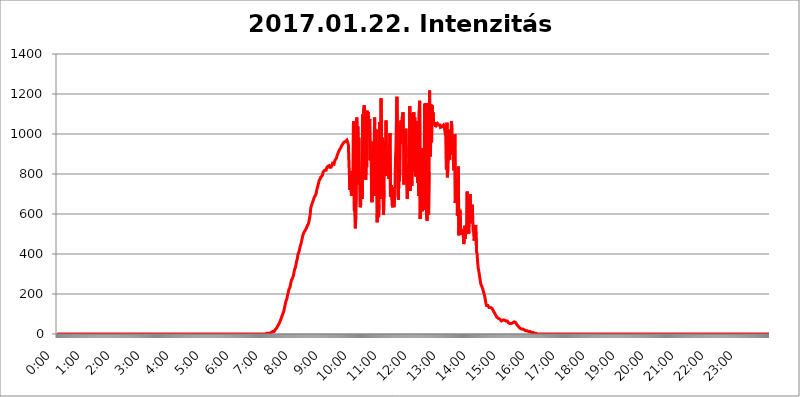
| Category | 2017.01.22. Intenzitás [W/m^2] |
|---|---|
| 0.0 | 0 |
| 0.0006944444444444445 | 0 |
| 0.001388888888888889 | 0 |
| 0.0020833333333333333 | 0 |
| 0.002777777777777778 | 0 |
| 0.003472222222222222 | 0 |
| 0.004166666666666667 | 0 |
| 0.004861111111111111 | 0 |
| 0.005555555555555556 | 0 |
| 0.0062499999999999995 | 0 |
| 0.006944444444444444 | 0 |
| 0.007638888888888889 | 0 |
| 0.008333333333333333 | 0 |
| 0.009027777777777779 | 0 |
| 0.009722222222222222 | 0 |
| 0.010416666666666666 | 0 |
| 0.011111111111111112 | 0 |
| 0.011805555555555555 | 0 |
| 0.012499999999999999 | 0 |
| 0.013194444444444444 | 0 |
| 0.013888888888888888 | 0 |
| 0.014583333333333332 | 0 |
| 0.015277777777777777 | 0 |
| 0.015972222222222224 | 0 |
| 0.016666666666666666 | 0 |
| 0.017361111111111112 | 0 |
| 0.018055555555555557 | 0 |
| 0.01875 | 0 |
| 0.019444444444444445 | 0 |
| 0.02013888888888889 | 0 |
| 0.020833333333333332 | 0 |
| 0.02152777777777778 | 0 |
| 0.022222222222222223 | 0 |
| 0.02291666666666667 | 0 |
| 0.02361111111111111 | 0 |
| 0.024305555555555556 | 0 |
| 0.024999999999999998 | 0 |
| 0.025694444444444447 | 0 |
| 0.02638888888888889 | 0 |
| 0.027083333333333334 | 0 |
| 0.027777777777777776 | 0 |
| 0.02847222222222222 | 0 |
| 0.029166666666666664 | 0 |
| 0.029861111111111113 | 0 |
| 0.030555555555555555 | 0 |
| 0.03125 | 0 |
| 0.03194444444444445 | 0 |
| 0.03263888888888889 | 0 |
| 0.03333333333333333 | 0 |
| 0.034027777777777775 | 0 |
| 0.034722222222222224 | 0 |
| 0.035416666666666666 | 0 |
| 0.036111111111111115 | 0 |
| 0.03680555555555556 | 0 |
| 0.0375 | 0 |
| 0.03819444444444444 | 0 |
| 0.03888888888888889 | 0 |
| 0.03958333333333333 | 0 |
| 0.04027777777777778 | 0 |
| 0.04097222222222222 | 0 |
| 0.041666666666666664 | 0 |
| 0.042361111111111106 | 0 |
| 0.04305555555555556 | 0 |
| 0.043750000000000004 | 0 |
| 0.044444444444444446 | 0 |
| 0.04513888888888889 | 0 |
| 0.04583333333333334 | 0 |
| 0.04652777777777778 | 0 |
| 0.04722222222222222 | 0 |
| 0.04791666666666666 | 0 |
| 0.04861111111111111 | 0 |
| 0.049305555555555554 | 0 |
| 0.049999999999999996 | 0 |
| 0.05069444444444445 | 0 |
| 0.051388888888888894 | 0 |
| 0.052083333333333336 | 0 |
| 0.05277777777777778 | 0 |
| 0.05347222222222222 | 0 |
| 0.05416666666666667 | 0 |
| 0.05486111111111111 | 0 |
| 0.05555555555555555 | 0 |
| 0.05625 | 0 |
| 0.05694444444444444 | 0 |
| 0.057638888888888885 | 0 |
| 0.05833333333333333 | 0 |
| 0.05902777777777778 | 0 |
| 0.059722222222222225 | 0 |
| 0.06041666666666667 | 0 |
| 0.061111111111111116 | 0 |
| 0.06180555555555556 | 0 |
| 0.0625 | 0 |
| 0.06319444444444444 | 0 |
| 0.06388888888888888 | 0 |
| 0.06458333333333334 | 0 |
| 0.06527777777777778 | 0 |
| 0.06597222222222222 | 0 |
| 0.06666666666666667 | 0 |
| 0.06736111111111111 | 0 |
| 0.06805555555555555 | 0 |
| 0.06874999999999999 | 0 |
| 0.06944444444444443 | 0 |
| 0.07013888888888889 | 0 |
| 0.07083333333333333 | 0 |
| 0.07152777777777779 | 0 |
| 0.07222222222222223 | 0 |
| 0.07291666666666667 | 0 |
| 0.07361111111111111 | 0 |
| 0.07430555555555556 | 0 |
| 0.075 | 0 |
| 0.07569444444444444 | 0 |
| 0.0763888888888889 | 0 |
| 0.07708333333333334 | 0 |
| 0.07777777777777778 | 0 |
| 0.07847222222222222 | 0 |
| 0.07916666666666666 | 0 |
| 0.0798611111111111 | 0 |
| 0.08055555555555556 | 0 |
| 0.08125 | 0 |
| 0.08194444444444444 | 0 |
| 0.08263888888888889 | 0 |
| 0.08333333333333333 | 0 |
| 0.08402777777777777 | 0 |
| 0.08472222222222221 | 0 |
| 0.08541666666666665 | 0 |
| 0.08611111111111112 | 0 |
| 0.08680555555555557 | 0 |
| 0.08750000000000001 | 0 |
| 0.08819444444444445 | 0 |
| 0.08888888888888889 | 0 |
| 0.08958333333333333 | 0 |
| 0.09027777777777778 | 0 |
| 0.09097222222222222 | 0 |
| 0.09166666666666667 | 0 |
| 0.09236111111111112 | 0 |
| 0.09305555555555556 | 0 |
| 0.09375 | 0 |
| 0.09444444444444444 | 0 |
| 0.09513888888888888 | 0 |
| 0.09583333333333333 | 0 |
| 0.09652777777777777 | 0 |
| 0.09722222222222222 | 0 |
| 0.09791666666666667 | 0 |
| 0.09861111111111111 | 0 |
| 0.09930555555555555 | 0 |
| 0.09999999999999999 | 0 |
| 0.10069444444444443 | 0 |
| 0.1013888888888889 | 0 |
| 0.10208333333333335 | 0 |
| 0.10277777777777779 | 0 |
| 0.10347222222222223 | 0 |
| 0.10416666666666667 | 0 |
| 0.10486111111111111 | 0 |
| 0.10555555555555556 | 0 |
| 0.10625 | 0 |
| 0.10694444444444444 | 0 |
| 0.1076388888888889 | 0 |
| 0.10833333333333334 | 0 |
| 0.10902777777777778 | 0 |
| 0.10972222222222222 | 0 |
| 0.1111111111111111 | 0 |
| 0.11180555555555556 | 0 |
| 0.11180555555555556 | 0 |
| 0.1125 | 0 |
| 0.11319444444444444 | 0 |
| 0.11388888888888889 | 0 |
| 0.11458333333333333 | 0 |
| 0.11527777777777777 | 0 |
| 0.11597222222222221 | 0 |
| 0.11666666666666665 | 0 |
| 0.1173611111111111 | 0 |
| 0.11805555555555557 | 0 |
| 0.11944444444444445 | 0 |
| 0.12013888888888889 | 0 |
| 0.12083333333333333 | 0 |
| 0.12152777777777778 | 0 |
| 0.12222222222222223 | 0 |
| 0.12291666666666667 | 0 |
| 0.12291666666666667 | 0 |
| 0.12361111111111112 | 0 |
| 0.12430555555555556 | 0 |
| 0.125 | 0 |
| 0.12569444444444444 | 0 |
| 0.12638888888888888 | 0 |
| 0.12708333333333333 | 0 |
| 0.16875 | 0 |
| 0.12847222222222224 | 0 |
| 0.12916666666666668 | 0 |
| 0.12986111111111112 | 0 |
| 0.13055555555555556 | 0 |
| 0.13125 | 0 |
| 0.13194444444444445 | 0 |
| 0.1326388888888889 | 0 |
| 0.13333333333333333 | 0 |
| 0.13402777777777777 | 0 |
| 0.13402777777777777 | 0 |
| 0.13472222222222222 | 0 |
| 0.13541666666666666 | 0 |
| 0.1361111111111111 | 0 |
| 0.13749999999999998 | 0 |
| 0.13819444444444443 | 0 |
| 0.1388888888888889 | 0 |
| 0.13958333333333334 | 0 |
| 0.14027777777777778 | 0 |
| 0.14097222222222222 | 0 |
| 0.14166666666666666 | 0 |
| 0.1423611111111111 | 0 |
| 0.14305555555555557 | 0 |
| 0.14375000000000002 | 0 |
| 0.14444444444444446 | 0 |
| 0.1451388888888889 | 0 |
| 0.1451388888888889 | 0 |
| 0.14652777777777778 | 0 |
| 0.14722222222222223 | 0 |
| 0.14791666666666667 | 0 |
| 0.1486111111111111 | 0 |
| 0.14930555555555555 | 0 |
| 0.15 | 0 |
| 0.15069444444444444 | 0 |
| 0.15138888888888888 | 0 |
| 0.15208333333333332 | 0 |
| 0.15277777777777776 | 0 |
| 0.15347222222222223 | 0 |
| 0.15416666666666667 | 0 |
| 0.15486111111111112 | 0 |
| 0.15555555555555556 | 0 |
| 0.15625 | 0 |
| 0.15694444444444444 | 0 |
| 0.15763888888888888 | 0 |
| 0.15833333333333333 | 0 |
| 0.15902777777777777 | 0 |
| 0.15972222222222224 | 0 |
| 0.16041666666666668 | 0 |
| 0.16111111111111112 | 0 |
| 0.16180555555555556 | 0 |
| 0.1625 | 0 |
| 0.16319444444444445 | 0 |
| 0.1638888888888889 | 0 |
| 0.16458333333333333 | 0 |
| 0.16527777777777777 | 0 |
| 0.16597222222222222 | 0 |
| 0.16666666666666666 | 0 |
| 0.1673611111111111 | 0 |
| 0.16805555555555554 | 0 |
| 0.16874999999999998 | 0 |
| 0.16944444444444443 | 0 |
| 0.17013888888888887 | 0 |
| 0.1708333333333333 | 0 |
| 0.17152777777777775 | 0 |
| 0.17222222222222225 | 0 |
| 0.1729166666666667 | 0 |
| 0.17361111111111113 | 0 |
| 0.17430555555555557 | 0 |
| 0.17500000000000002 | 0 |
| 0.17569444444444446 | 0 |
| 0.1763888888888889 | 0 |
| 0.17708333333333334 | 0 |
| 0.17777777777777778 | 0 |
| 0.17847222222222223 | 0 |
| 0.17916666666666667 | 0 |
| 0.1798611111111111 | 0 |
| 0.18055555555555555 | 0 |
| 0.18125 | 0 |
| 0.18194444444444444 | 0 |
| 0.1826388888888889 | 0 |
| 0.18333333333333335 | 0 |
| 0.1840277777777778 | 0 |
| 0.18472222222222223 | 0 |
| 0.18541666666666667 | 0 |
| 0.18611111111111112 | 0 |
| 0.18680555555555556 | 0 |
| 0.1875 | 0 |
| 0.18819444444444444 | 0 |
| 0.18888888888888888 | 0 |
| 0.18958333333333333 | 0 |
| 0.19027777777777777 | 0 |
| 0.1909722222222222 | 0 |
| 0.19166666666666665 | 0 |
| 0.19236111111111112 | 0 |
| 0.19305555555555554 | 0 |
| 0.19375 | 0 |
| 0.19444444444444445 | 0 |
| 0.1951388888888889 | 0 |
| 0.19583333333333333 | 0 |
| 0.19652777777777777 | 0 |
| 0.19722222222222222 | 0 |
| 0.19791666666666666 | 0 |
| 0.1986111111111111 | 0 |
| 0.19930555555555554 | 0 |
| 0.19999999999999998 | 0 |
| 0.20069444444444443 | 0 |
| 0.20138888888888887 | 0 |
| 0.2020833333333333 | 0 |
| 0.2027777777777778 | 0 |
| 0.2034722222222222 | 0 |
| 0.2041666666666667 | 0 |
| 0.20486111111111113 | 0 |
| 0.20555555555555557 | 0 |
| 0.20625000000000002 | 0 |
| 0.20694444444444446 | 0 |
| 0.2076388888888889 | 0 |
| 0.20833333333333334 | 0 |
| 0.20902777777777778 | 0 |
| 0.20972222222222223 | 0 |
| 0.21041666666666667 | 0 |
| 0.2111111111111111 | 0 |
| 0.21180555555555555 | 0 |
| 0.2125 | 0 |
| 0.21319444444444444 | 0 |
| 0.2138888888888889 | 0 |
| 0.21458333333333335 | 0 |
| 0.2152777777777778 | 0 |
| 0.21597222222222223 | 0 |
| 0.21666666666666667 | 0 |
| 0.21736111111111112 | 0 |
| 0.21805555555555556 | 0 |
| 0.21875 | 0 |
| 0.21944444444444444 | 0 |
| 0.22013888888888888 | 0 |
| 0.22083333333333333 | 0 |
| 0.22152777777777777 | 0 |
| 0.2222222222222222 | 0 |
| 0.22291666666666665 | 0 |
| 0.2236111111111111 | 0 |
| 0.22430555555555556 | 0 |
| 0.225 | 0 |
| 0.22569444444444445 | 0 |
| 0.2263888888888889 | 0 |
| 0.22708333333333333 | 0 |
| 0.22777777777777777 | 0 |
| 0.22847222222222222 | 0 |
| 0.22916666666666666 | 0 |
| 0.2298611111111111 | 0 |
| 0.23055555555555554 | 0 |
| 0.23124999999999998 | 0 |
| 0.23194444444444443 | 0 |
| 0.23263888888888887 | 0 |
| 0.2333333333333333 | 0 |
| 0.2340277777777778 | 0 |
| 0.2347222222222222 | 0 |
| 0.2354166666666667 | 0 |
| 0.23611111111111113 | 0 |
| 0.23680555555555557 | 0 |
| 0.23750000000000002 | 0 |
| 0.23819444444444446 | 0 |
| 0.2388888888888889 | 0 |
| 0.23958333333333334 | 0 |
| 0.24027777777777778 | 0 |
| 0.24097222222222223 | 0 |
| 0.24166666666666667 | 0 |
| 0.2423611111111111 | 0 |
| 0.24305555555555555 | 0 |
| 0.24375 | 0 |
| 0.24444444444444446 | 0 |
| 0.24513888888888888 | 0 |
| 0.24583333333333335 | 0 |
| 0.2465277777777778 | 0 |
| 0.24722222222222223 | 0 |
| 0.24791666666666667 | 0 |
| 0.24861111111111112 | 0 |
| 0.24930555555555556 | 0 |
| 0.25 | 0 |
| 0.25069444444444444 | 0 |
| 0.2513888888888889 | 0 |
| 0.2520833333333333 | 0 |
| 0.25277777777777777 | 0 |
| 0.2534722222222222 | 0 |
| 0.25416666666666665 | 0 |
| 0.2548611111111111 | 0 |
| 0.2555555555555556 | 0 |
| 0.25625000000000003 | 0 |
| 0.2569444444444445 | 0 |
| 0.2576388888888889 | 0 |
| 0.25833333333333336 | 0 |
| 0.2590277777777778 | 0 |
| 0.25972222222222224 | 0 |
| 0.2604166666666667 | 0 |
| 0.2611111111111111 | 0 |
| 0.26180555555555557 | 0 |
| 0.2625 | 0 |
| 0.26319444444444445 | 0 |
| 0.2638888888888889 | 0 |
| 0.26458333333333334 | 0 |
| 0.2652777777777778 | 0 |
| 0.2659722222222222 | 0 |
| 0.26666666666666666 | 0 |
| 0.2673611111111111 | 0 |
| 0.26805555555555555 | 0 |
| 0.26875 | 0 |
| 0.26944444444444443 | 0 |
| 0.2701388888888889 | 0 |
| 0.2708333333333333 | 0 |
| 0.27152777777777776 | 0 |
| 0.2722222222222222 | 0 |
| 0.27291666666666664 | 0 |
| 0.2736111111111111 | 0 |
| 0.2743055555555555 | 0 |
| 0.27499999999999997 | 0 |
| 0.27569444444444446 | 0 |
| 0.27638888888888885 | 0 |
| 0.27708333333333335 | 0 |
| 0.2777777777777778 | 0 |
| 0.27847222222222223 | 0 |
| 0.2791666666666667 | 0 |
| 0.2798611111111111 | 0 |
| 0.28055555555555556 | 0 |
| 0.28125 | 0 |
| 0.28194444444444444 | 0 |
| 0.2826388888888889 | 0 |
| 0.2833333333333333 | 0 |
| 0.28402777777777777 | 0 |
| 0.2847222222222222 | 0 |
| 0.28541666666666665 | 0 |
| 0.28611111111111115 | 0 |
| 0.28680555555555554 | 0 |
| 0.28750000000000003 | 0 |
| 0.2881944444444445 | 0 |
| 0.2888888888888889 | 0 |
| 0.28958333333333336 | 0 |
| 0.2902777777777778 | 0 |
| 0.29097222222222224 | 0 |
| 0.2916666666666667 | 0 |
| 0.2923611111111111 | 3.525 |
| 0.29305555555555557 | 3.525 |
| 0.29375 | 3.525 |
| 0.29444444444444445 | 3.525 |
| 0.2951388888888889 | 3.525 |
| 0.29583333333333334 | 3.525 |
| 0.2965277777777778 | 3.525 |
| 0.2972222222222222 | 3.525 |
| 0.29791666666666666 | 3.525 |
| 0.2986111111111111 | 3.525 |
| 0.29930555555555555 | 3.525 |
| 0.3 | 7.887 |
| 0.30069444444444443 | 7.887 |
| 0.3013888888888889 | 7.887 |
| 0.3020833333333333 | 12.257 |
| 0.30277777777777776 | 12.257 |
| 0.3034722222222222 | 12.257 |
| 0.30416666666666664 | 12.257 |
| 0.3048611111111111 | 16.636 |
| 0.3055555555555555 | 21.024 |
| 0.30624999999999997 | 21.024 |
| 0.3069444444444444 | 25.419 |
| 0.3076388888888889 | 29.823 |
| 0.30833333333333335 | 34.234 |
| 0.3090277777777778 | 38.653 |
| 0.30972222222222223 | 43.079 |
| 0.3104166666666667 | 47.511 |
| 0.3111111111111111 | 51.951 |
| 0.31180555555555556 | 56.398 |
| 0.3125 | 60.85 |
| 0.31319444444444444 | 69.775 |
| 0.3138888888888889 | 74.246 |
| 0.3145833333333333 | 83.205 |
| 0.31527777777777777 | 87.692 |
| 0.3159722222222222 | 96.682 |
| 0.31666666666666665 | 101.184 |
| 0.31736111111111115 | 110.201 |
| 0.31805555555555554 | 119.235 |
| 0.31875000000000003 | 132.814 |
| 0.3194444444444445 | 141.884 |
| 0.3201388888888889 | 155.509 |
| 0.32083333333333336 | 164.605 |
| 0.3215277777777778 | 169.156 |
| 0.32222222222222224 | 178.264 |
| 0.3229166666666667 | 191.937 |
| 0.3236111111111111 | 201.058 |
| 0.32430555555555557 | 214.746 |
| 0.325 | 223.873 |
| 0.32569444444444445 | 223.873 |
| 0.3263888888888889 | 233 |
| 0.32708333333333334 | 246.689 |
| 0.3277777777777778 | 251.251 |
| 0.3284722222222222 | 269.49 |
| 0.32916666666666666 | 269.49 |
| 0.3298611111111111 | 278.603 |
| 0.33055555555555555 | 283.156 |
| 0.33125 | 292.259 |
| 0.33194444444444443 | 305.898 |
| 0.3326388888888889 | 319.517 |
| 0.3333333333333333 | 324.052 |
| 0.3340277777777778 | 333.113 |
| 0.3347222222222222 | 342.162 |
| 0.3354166666666667 | 360.221 |
| 0.3361111111111111 | 364.728 |
| 0.3368055555555556 | 378.224 |
| 0.33749999999999997 | 396.164 |
| 0.33819444444444446 | 400.638 |
| 0.33888888888888885 | 409.574 |
| 0.33958333333333335 | 418.492 |
| 0.34027777777777773 | 431.833 |
| 0.34097222222222223 | 440.702 |
| 0.3416666666666666 | 449.551 |
| 0.3423611111111111 | 458.38 |
| 0.3430555555555555 | 471.582 |
| 0.34375 | 480.356 |
| 0.3444444444444445 | 493.475 |
| 0.3451388888888889 | 497.836 |
| 0.3458333333333334 | 506.542 |
| 0.34652777777777777 | 506.542 |
| 0.34722222222222227 | 510.885 |
| 0.34791666666666665 | 519.555 |
| 0.34861111111111115 | 523.88 |
| 0.34930555555555554 | 528.2 |
| 0.35000000000000003 | 532.513 |
| 0.3506944444444444 | 541.121 |
| 0.3513888888888889 | 541.121 |
| 0.3520833333333333 | 549.704 |
| 0.3527777777777778 | 558.261 |
| 0.3534722222222222 | 571.049 |
| 0.3541666666666667 | 583.779 |
| 0.3548611111111111 | 600.661 |
| 0.35555555555555557 | 629.948 |
| 0.35625 | 638.256 |
| 0.35694444444444445 | 642.4 |
| 0.3576388888888889 | 654.791 |
| 0.35833333333333334 | 658.909 |
| 0.3590277777777778 | 667.123 |
| 0.3597222222222222 | 671.22 |
| 0.36041666666666666 | 683.473 |
| 0.3611111111111111 | 683.473 |
| 0.36180555555555555 | 687.544 |
| 0.3625 | 695.666 |
| 0.36319444444444443 | 703.762 |
| 0.3638888888888889 | 719.877 |
| 0.3645833333333333 | 727.896 |
| 0.3652777777777778 | 735.89 |
| 0.3659722222222222 | 747.834 |
| 0.3666666666666667 | 755.766 |
| 0.3673611111111111 | 767.62 |
| 0.3680555555555556 | 771.559 |
| 0.36874999999999997 | 775.492 |
| 0.36944444444444446 | 783.342 |
| 0.37013888888888885 | 783.342 |
| 0.37083333333333335 | 787.258 |
| 0.37152777777777773 | 791.169 |
| 0.37222222222222223 | 798.974 |
| 0.3729166666666666 | 810.641 |
| 0.3736111111111111 | 814.519 |
| 0.3743055555555555 | 814.519 |
| 0.375 | 818.392 |
| 0.3756944444444445 | 818.392 |
| 0.3763888888888889 | 818.392 |
| 0.3770833333333334 | 818.392 |
| 0.37777777777777777 | 829.981 |
| 0.37847222222222227 | 829.981 |
| 0.37916666666666665 | 837.682 |
| 0.37986111111111115 | 837.682 |
| 0.38055555555555554 | 837.682 |
| 0.38125000000000003 | 841.526 |
| 0.3819444444444444 | 833.834 |
| 0.3826388888888889 | 833.834 |
| 0.3833333333333333 | 829.981 |
| 0.3840277777777778 | 833.834 |
| 0.3847222222222222 | 837.682 |
| 0.3854166666666667 | 845.365 |
| 0.3861111111111111 | 853.029 |
| 0.38680555555555557 | 853.029 |
| 0.3875 | 853.029 |
| 0.38819444444444445 | 849.199 |
| 0.3888888888888889 | 860.676 |
| 0.38958333333333334 | 868.305 |
| 0.3902777777777778 | 872.114 |
| 0.3909722222222222 | 868.305 |
| 0.39166666666666666 | 879.719 |
| 0.3923611111111111 | 891.099 |
| 0.39305555555555555 | 894.885 |
| 0.39375 | 894.885 |
| 0.39444444444444443 | 909.996 |
| 0.3951388888888889 | 913.766 |
| 0.3958333333333333 | 913.766 |
| 0.3965277777777778 | 925.06 |
| 0.3972222222222222 | 928.819 |
| 0.3979166666666667 | 932.576 |
| 0.3986111111111111 | 940.082 |
| 0.3993055555555556 | 940.082 |
| 0.39999999999999997 | 947.58 |
| 0.40069444444444446 | 951.327 |
| 0.40138888888888885 | 951.327 |
| 0.40208333333333335 | 958.814 |
| 0.40277777777777773 | 962.555 |
| 0.40347222222222223 | 962.555 |
| 0.4041666666666666 | 962.555 |
| 0.4048611111111111 | 966.295 |
| 0.4055555555555555 | 962.555 |
| 0.40625 | 970.034 |
| 0.4069444444444445 | 970.034 |
| 0.4076388888888889 | 955.071 |
| 0.4083333333333334 | 943.832 |
| 0.40902777777777777 | 868.305 |
| 0.40972222222222227 | 864.493 |
| 0.41041666666666665 | 719.877 |
| 0.41111111111111115 | 814.519 |
| 0.41180555555555554 | 727.896 |
| 0.41250000000000003 | 691.608 |
| 0.4131944444444444 | 723.889 |
| 0.4138888888888889 | 715.858 |
| 0.4145833333333333 | 735.89 |
| 0.4152777777777778 | 1044.762 |
| 0.4159722222222222 | 1063.51 |
| 0.4166666666666667 | 617.436 |
| 0.4173611111111111 | 609.062 |
| 0.41805555555555557 | 528.2 |
| 0.41875 | 592.233 |
| 0.41944444444444445 | 671.22 |
| 0.4201388888888889 | 1082.324 |
| 0.42083333333333334 | 747.834 |
| 0.4215277777777778 | 1037.277 |
| 0.4222222222222222 | 798.974 |
| 0.42291666666666666 | 981.244 |
| 0.4236111111111111 | 795.074 |
| 0.42430555555555555 | 810.641 |
| 0.425 | 634.105 |
| 0.42569444444444443 | 650.667 |
| 0.4263888888888889 | 767.62 |
| 0.4270833333333333 | 795.074 |
| 0.4277777777777778 | 675.311 |
| 0.4284722222222222 | 1097.437 |
| 0.4291666666666667 | 779.42 |
| 0.4298611111111111 | 1127.879 |
| 0.4305555555555556 | 1143.232 |
| 0.43124999999999997 | 1108.816 |
| 0.43194444444444446 | 849.199 |
| 0.43263888888888885 | 771.559 |
| 0.43333333333333335 | 849.199 |
| 0.43402777777777773 | 833.834 |
| 0.43472222222222223 | 1116.426 |
| 0.4354166666666666 | 1059.756 |
| 0.4361111111111111 | 1108.816 |
| 0.4368055555555555 | 1033.537 |
| 0.4375 | 1003.65 |
| 0.4381944444444445 | 1074.789 |
| 0.4388888888888889 | 868.305 |
| 0.4395833333333334 | 894.885 |
| 0.44027777777777777 | 962.555 |
| 0.44097222222222227 | 667.123 |
| 0.44166666666666665 | 658.909 |
| 0.44236111111111115 | 845.365 |
| 0.44305555555555554 | 767.62 |
| 0.44375000000000003 | 723.889 |
| 0.4444444444444444 | 928.819 |
| 0.4451388888888889 | 1082.324 |
| 0.4458333333333333 | 691.608 |
| 0.4465277777777778 | 759.723 |
| 0.4472222222222222 | 1022.323 |
| 0.4479166666666667 | 755.766 |
| 0.4486111111111111 | 558.261 |
| 0.44930555555555557 | 634.105 |
| 0.45 | 683.473 |
| 0.45069444444444445 | 583.779 |
| 0.4513888888888889 | 646.537 |
| 0.45208333333333334 | 1059.756 |
| 0.4527777777777778 | 675.311 |
| 0.4534722222222222 | 795.074 |
| 0.45416666666666666 | 1178.177 |
| 0.4548611111111111 | 860.676 |
| 0.45555555555555555 | 759.723 |
| 0.45625 | 981.244 |
| 0.45694444444444443 | 695.666 |
| 0.4576388888888889 | 596.45 |
| 0.4583333333333333 | 719.877 |
| 0.4590277777777778 | 962.555 |
| 0.4597222222222222 | 814.519 |
| 0.4604166666666667 | 887.309 |
| 0.4611111111111111 | 1067.267 |
| 0.4618055555555556 | 791.169 |
| 0.46249999999999997 | 868.305 |
| 0.46319444444444446 | 902.447 |
| 0.46388888888888885 | 928.819 |
| 0.46458333333333335 | 932.576 |
| 0.46527777777777773 | 775.492 |
| 0.46597222222222223 | 943.832 |
| 0.4666666666666666 | 1003.65 |
| 0.4673611111111111 | 687.544 |
| 0.4680555555555555 | 683.473 |
| 0.46875 | 743.859 |
| 0.4694444444444445 | 747.834 |
| 0.4701388888888889 | 634.105 |
| 0.4708333333333334 | 731.896 |
| 0.47152777777777777 | 683.473 |
| 0.47222222222222227 | 634.105 |
| 0.47291666666666665 | 638.256 |
| 0.47361111111111115 | 703.762 |
| 0.47430555555555554 | 864.493 |
| 0.47500000000000003 | 928.819 |
| 0.4756944444444444 | 925.06 |
| 0.4763888888888889 | 1186.03 |
| 0.4770833333333333 | 992.448 |
| 0.4777777777777778 | 735.89 |
| 0.4784722222222222 | 671.22 |
| 0.4791666666666667 | 791.169 |
| 0.4798611111111111 | 763.674 |
| 0.48055555555555557 | 822.26 |
| 0.48125 | 1018.587 |
| 0.48194444444444445 | 1067.267 |
| 0.4826388888888889 | 951.327 |
| 0.48333333333333334 | 955.071 |
| 0.4840277777777778 | 1086.097 |
| 0.4847222222222222 | 1108.816 |
| 0.48541666666666666 | 1097.437 |
| 0.4861111111111111 | 747.834 |
| 0.48680555555555555 | 902.447 |
| 0.4875 | 943.832 |
| 0.48819444444444443 | 875.918 |
| 0.4888888888888889 | 1026.06 |
| 0.4895833333333333 | 879.719 |
| 0.4902777777777778 | 735.89 |
| 0.4909722222222222 | 675.311 |
| 0.4916666666666667 | 829.981 |
| 0.4923611111111111 | 723.889 |
| 0.4930555555555556 | 822.26 |
| 0.49374999999999997 | 860.676 |
| 0.49444444444444446 | 1139.384 |
| 0.49513888888888885 | 715.858 |
| 0.49583333333333335 | 779.42 |
| 0.49652777777777773 | 1063.51 |
| 0.49722222222222223 | 739.877 |
| 0.4979166666666666 | 1105.019 |
| 0.4986111111111111 | 853.029 |
| 0.4993055555555555 | 810.641 |
| 0.5 | 1108.816 |
| 0.5006944444444444 | 875.918 |
| 0.5013888888888889 | 1082.324 |
| 0.5020833333333333 | 1003.65 |
| 0.5027777777777778 | 787.258 |
| 0.5034722222222222 | 1063.51 |
| 0.5041666666666667 | 955.071 |
| 0.5048611111111111 | 883.516 |
| 0.5055555555555555 | 755.766 |
| 0.50625 | 906.223 |
| 0.5069444444444444 | 691.608 |
| 0.5076388888888889 | 1116.426 |
| 0.5083333333333333 | 1166.46 |
| 0.5090277777777777 | 575.299 |
| 0.5097222222222222 | 629.948 |
| 0.5104166666666666 | 818.392 |
| 0.5111111111111112 | 883.516 |
| 0.5118055555555555 | 613.252 |
| 0.5125000000000001 | 928.819 |
| 0.5131944444444444 | 787.258 |
| 0.513888888888889 | 759.723 |
| 0.5145833333333333 | 860.676 |
| 0.5152777777777778 | 1150.946 |
| 0.5159722222222222 | 787.258 |
| 0.5166666666666667 | 621.613 |
| 0.517361111111111 | 1154.814 |
| 0.5180555555555556 | 588.009 |
| 0.5187499999999999 | 566.793 |
| 0.5194444444444445 | 833.834 |
| 0.5201388888888888 | 667.123 |
| 0.5208333333333334 | 596.45 |
| 0.5215277777777778 | 810.641 |
| 0.5222222222222223 | 1217.812 |
| 0.5229166666666667 | 887.309 |
| 0.5236111111111111 | 925.06 |
| 0.5243055555555556 | 1147.086 |
| 0.525 | 958.814 |
| 0.5256944444444445 | 1143.232 |
| 0.5263888888888889 | 1097.437 |
| 0.5270833333333333 | 1108.816 |
| 0.5277777777777778 | 1059.756 |
| 0.5284722222222222 | 1048.508 |
| 0.5291666666666667 | 1059.756 |
| 0.5298611111111111 | 1044.762 |
| 0.5305555555555556 | 1037.277 |
| 0.53125 | 1056.004 |
| 0.5319444444444444 | 1044.762 |
| 0.5326388888888889 | 1044.762 |
| 0.5333333333333333 | 1052.255 |
| 0.5340277777777778 | 1056.004 |
| 0.5347222222222222 | 1044.762 |
| 0.5354166666666667 | 1044.762 |
| 0.5361111111111111 | 1048.508 |
| 0.5368055555555555 | 1044.762 |
| 0.5375 | 1033.537 |
| 0.5381944444444444 | 1033.537 |
| 0.5388888888888889 | 1037.277 |
| 0.5395833333333333 | 1037.277 |
| 0.5402777777777777 | 1037.277 |
| 0.5409722222222222 | 1033.537 |
| 0.5416666666666666 | 1044.762 |
| 0.5423611111111112 | 1037.277 |
| 0.5430555555555555 | 1033.537 |
| 0.5437500000000001 | 1014.852 |
| 0.5444444444444444 | 992.448 |
| 0.545138888888889 | 1022.323 |
| 0.5458333333333333 | 822.26 |
| 0.5465277777777778 | 1056.004 |
| 0.5472222222222222 | 783.342 |
| 0.5479166666666667 | 837.682 |
| 0.548611111111111 | 875.918 |
| 0.5493055555555556 | 1022.323 |
| 0.5499999999999999 | 872.114 |
| 0.5506944444444445 | 1011.118 |
| 0.5513888888888888 | 917.534 |
| 0.5520833333333334 | 932.576 |
| 0.5527777777777778 | 1063.51 |
| 0.5534722222222223 | 1033.537 |
| 0.5541666666666667 | 894.885 |
| 0.5548611111111111 | 951.327 |
| 0.5555555555555556 | 868.305 |
| 0.55625 | 818.392 |
| 0.5569444444444445 | 868.305 |
| 0.5576388888888889 | 999.916 |
| 0.5583333333333333 | 654.791 |
| 0.5590277777777778 | 779.42 |
| 0.5597222222222222 | 783.342 |
| 0.5604166666666667 | 759.723 |
| 0.5611111111111111 | 592.233 |
| 0.5618055555555556 | 617.436 |
| 0.5625 | 837.682 |
| 0.5631944444444444 | 493.475 |
| 0.5638888888888889 | 515.223 |
| 0.5645833333333333 | 621.613 |
| 0.5652777777777778 | 600.661 |
| 0.5659722222222222 | 497.836 |
| 0.5666666666666667 | 506.542 |
| 0.5673611111111111 | 502.192 |
| 0.5680555555555555 | 502.192 |
| 0.56875 | 515.223 |
| 0.5694444444444444 | 489.108 |
| 0.5701388888888889 | 449.551 |
| 0.5708333333333333 | 471.582 |
| 0.5715277777777777 | 541.121 |
| 0.5722222222222222 | 475.972 |
| 0.5729166666666666 | 475.972 |
| 0.5736111111111112 | 532.513 |
| 0.5743055555555555 | 502.192 |
| 0.5750000000000001 | 711.832 |
| 0.5756944444444444 | 523.88 |
| 0.576388888888889 | 571.049 |
| 0.5770833333333333 | 502.192 |
| 0.5777777777777778 | 600.661 |
| 0.5784722222222222 | 625.784 |
| 0.5791666666666667 | 699.717 |
| 0.579861111111111 | 579.542 |
| 0.5805555555555556 | 588.009 |
| 0.5812499999999999 | 553.986 |
| 0.5819444444444445 | 646.537 |
| 0.5826388888888888 | 588.009 |
| 0.5833333333333334 | 515.223 |
| 0.5840277777777778 | 506.542 |
| 0.5847222222222223 | 467.187 |
| 0.5854166666666667 | 467.187 |
| 0.5861111111111111 | 502.192 |
| 0.5868055555555556 | 545.416 |
| 0.5875 | 541.121 |
| 0.5881944444444445 | 409.574 |
| 0.5888888888888889 | 400.638 |
| 0.5895833333333333 | 360.221 |
| 0.5902777777777778 | 333.113 |
| 0.5909722222222222 | 319.517 |
| 0.5916666666666667 | 305.898 |
| 0.5923611111111111 | 287.709 |
| 0.5930555555555556 | 274.047 |
| 0.59375 | 255.813 |
| 0.5944444444444444 | 246.689 |
| 0.5951388888888889 | 246.689 |
| 0.5958333333333333 | 242.127 |
| 0.5965277777777778 | 228.436 |
| 0.5972222222222222 | 219.309 |
| 0.5979166666666667 | 223.873 |
| 0.5986111111111111 | 201.058 |
| 0.5993055555555555 | 191.937 |
| 0.6 | 178.264 |
| 0.6006944444444444 | 164.605 |
| 0.6013888888888889 | 150.964 |
| 0.6020833333333333 | 141.884 |
| 0.6027777777777777 | 141.884 |
| 0.6034722222222222 | 141.884 |
| 0.6041666666666666 | 141.884 |
| 0.6048611111111112 | 137.347 |
| 0.6055555555555555 | 132.814 |
| 0.6062500000000001 | 132.814 |
| 0.6069444444444444 | 132.814 |
| 0.607638888888889 | 132.814 |
| 0.6083333333333333 | 132.814 |
| 0.6090277777777778 | 132.814 |
| 0.6097222222222222 | 128.284 |
| 0.6104166666666667 | 123.758 |
| 0.611111111111111 | 119.235 |
| 0.6118055555555556 | 114.716 |
| 0.6124999999999999 | 110.201 |
| 0.6131944444444445 | 105.69 |
| 0.6138888888888888 | 101.184 |
| 0.6145833333333334 | 96.682 |
| 0.6152777777777778 | 92.184 |
| 0.6159722222222223 | 87.692 |
| 0.6166666666666667 | 83.205 |
| 0.6173611111111111 | 83.205 |
| 0.6180555555555556 | 83.205 |
| 0.61875 | 78.722 |
| 0.6194444444444445 | 78.722 |
| 0.6201388888888889 | 78.722 |
| 0.6208333333333333 | 74.246 |
| 0.6215277777777778 | 69.775 |
| 0.6222222222222222 | 69.775 |
| 0.6229166666666667 | 65.31 |
| 0.6236111111111111 | 65.31 |
| 0.6243055555555556 | 69.775 |
| 0.625 | 69.775 |
| 0.6256944444444444 | 74.246 |
| 0.6263888888888889 | 74.246 |
| 0.6270833333333333 | 69.775 |
| 0.6277777777777778 | 65.31 |
| 0.6284722222222222 | 65.31 |
| 0.6291666666666667 | 65.31 |
| 0.6298611111111111 | 69.775 |
| 0.6305555555555555 | 69.775 |
| 0.63125 | 65.31 |
| 0.6319444444444444 | 60.85 |
| 0.6326388888888889 | 56.398 |
| 0.6333333333333333 | 56.398 |
| 0.6340277777777777 | 51.951 |
| 0.6347222222222222 | 51.951 |
| 0.6354166666666666 | 51.951 |
| 0.6361111111111112 | 51.951 |
| 0.6368055555555555 | 51.951 |
| 0.6375000000000001 | 56.398 |
| 0.6381944444444444 | 56.398 |
| 0.638888888888889 | 56.398 |
| 0.6395833333333333 | 56.398 |
| 0.6402777777777778 | 60.85 |
| 0.6409722222222222 | 60.85 |
| 0.6416666666666667 | 60.85 |
| 0.642361111111111 | 56.398 |
| 0.6430555555555556 | 56.398 |
| 0.6437499999999999 | 51.951 |
| 0.6444444444444445 | 47.511 |
| 0.6451388888888888 | 47.511 |
| 0.6458333333333334 | 43.079 |
| 0.6465277777777778 | 38.653 |
| 0.6472222222222223 | 34.234 |
| 0.6479166666666667 | 34.234 |
| 0.6486111111111111 | 29.823 |
| 0.6493055555555556 | 29.823 |
| 0.65 | 29.823 |
| 0.6506944444444445 | 25.419 |
| 0.6513888888888889 | 25.419 |
| 0.6520833333333333 | 25.419 |
| 0.6527777777777778 | 25.419 |
| 0.6534722222222222 | 25.419 |
| 0.6541666666666667 | 21.024 |
| 0.6548611111111111 | 21.024 |
| 0.6555555555555556 | 16.636 |
| 0.65625 | 16.636 |
| 0.6569444444444444 | 16.636 |
| 0.6576388888888889 | 16.636 |
| 0.6583333333333333 | 16.636 |
| 0.6590277777777778 | 16.636 |
| 0.6597222222222222 | 12.257 |
| 0.6604166666666667 | 12.257 |
| 0.6611111111111111 | 12.257 |
| 0.6618055555555555 | 12.257 |
| 0.6625 | 12.257 |
| 0.6631944444444444 | 12.257 |
| 0.6638888888888889 | 7.887 |
| 0.6645833333333333 | 7.887 |
| 0.6652777777777777 | 7.887 |
| 0.6659722222222222 | 7.887 |
| 0.6666666666666666 | 7.887 |
| 0.6673611111111111 | 7.887 |
| 0.6680555555555556 | 7.887 |
| 0.6687500000000001 | 7.887 |
| 0.6694444444444444 | 3.525 |
| 0.6701388888888888 | 3.525 |
| 0.6708333333333334 | 3.525 |
| 0.6715277777777778 | 3.525 |
| 0.6722222222222222 | 3.525 |
| 0.6729166666666666 | 3.525 |
| 0.6736111111111112 | 0 |
| 0.6743055555555556 | 0 |
| 0.6749999999999999 | 0 |
| 0.6756944444444444 | 0 |
| 0.6763888888888889 | 0 |
| 0.6770833333333334 | 0 |
| 0.6777777777777777 | 0 |
| 0.6784722222222223 | 0 |
| 0.6791666666666667 | 0 |
| 0.6798611111111111 | 0 |
| 0.6805555555555555 | 0 |
| 0.68125 | 0 |
| 0.6819444444444445 | 0 |
| 0.6826388888888889 | 0 |
| 0.6833333333333332 | 0 |
| 0.6840277777777778 | 0 |
| 0.6847222222222222 | 0 |
| 0.6854166666666667 | 0 |
| 0.686111111111111 | 0 |
| 0.6868055555555556 | 0 |
| 0.6875 | 0 |
| 0.6881944444444444 | 0 |
| 0.688888888888889 | 0 |
| 0.6895833333333333 | 0 |
| 0.6902777777777778 | 0 |
| 0.6909722222222222 | 0 |
| 0.6916666666666668 | 0 |
| 0.6923611111111111 | 0 |
| 0.6930555555555555 | 0 |
| 0.69375 | 0 |
| 0.6944444444444445 | 0 |
| 0.6951388888888889 | 0 |
| 0.6958333333333333 | 0 |
| 0.6965277777777777 | 0 |
| 0.6972222222222223 | 0 |
| 0.6979166666666666 | 0 |
| 0.6986111111111111 | 0 |
| 0.6993055555555556 | 0 |
| 0.7000000000000001 | 0 |
| 0.7006944444444444 | 0 |
| 0.7013888888888888 | 0 |
| 0.7020833333333334 | 0 |
| 0.7027777777777778 | 0 |
| 0.7034722222222222 | 0 |
| 0.7041666666666666 | 0 |
| 0.7048611111111112 | 0 |
| 0.7055555555555556 | 0 |
| 0.7062499999999999 | 0 |
| 0.7069444444444444 | 0 |
| 0.7076388888888889 | 0 |
| 0.7083333333333334 | 0 |
| 0.7090277777777777 | 0 |
| 0.7097222222222223 | 0 |
| 0.7104166666666667 | 0 |
| 0.7111111111111111 | 0 |
| 0.7118055555555555 | 0 |
| 0.7125 | 0 |
| 0.7131944444444445 | 0 |
| 0.7138888888888889 | 0 |
| 0.7145833333333332 | 0 |
| 0.7152777777777778 | 0 |
| 0.7159722222222222 | 0 |
| 0.7166666666666667 | 0 |
| 0.717361111111111 | 0 |
| 0.7180555555555556 | 0 |
| 0.71875 | 0 |
| 0.7194444444444444 | 0 |
| 0.720138888888889 | 0 |
| 0.7208333333333333 | 0 |
| 0.7215277777777778 | 0 |
| 0.7222222222222222 | 0 |
| 0.7229166666666668 | 0 |
| 0.7236111111111111 | 0 |
| 0.7243055555555555 | 0 |
| 0.725 | 0 |
| 0.7256944444444445 | 0 |
| 0.7263888888888889 | 0 |
| 0.7270833333333333 | 0 |
| 0.7277777777777777 | 0 |
| 0.7284722222222223 | 0 |
| 0.7291666666666666 | 0 |
| 0.7298611111111111 | 0 |
| 0.7305555555555556 | 0 |
| 0.7312500000000001 | 0 |
| 0.7319444444444444 | 0 |
| 0.7326388888888888 | 0 |
| 0.7333333333333334 | 0 |
| 0.7340277777777778 | 0 |
| 0.7347222222222222 | 0 |
| 0.7354166666666666 | 0 |
| 0.7361111111111112 | 0 |
| 0.7368055555555556 | 0 |
| 0.7374999999999999 | 0 |
| 0.7381944444444444 | 0 |
| 0.7388888888888889 | 0 |
| 0.7395833333333334 | 0 |
| 0.7402777777777777 | 0 |
| 0.7409722222222223 | 0 |
| 0.7416666666666667 | 0 |
| 0.7423611111111111 | 0 |
| 0.7430555555555555 | 0 |
| 0.74375 | 0 |
| 0.7444444444444445 | 0 |
| 0.7451388888888889 | 0 |
| 0.7458333333333332 | 0 |
| 0.7465277777777778 | 0 |
| 0.7472222222222222 | 0 |
| 0.7479166666666667 | 0 |
| 0.748611111111111 | 0 |
| 0.7493055555555556 | 0 |
| 0.75 | 0 |
| 0.7506944444444444 | 0 |
| 0.751388888888889 | 0 |
| 0.7520833333333333 | 0 |
| 0.7527777777777778 | 0 |
| 0.7534722222222222 | 0 |
| 0.7541666666666668 | 0 |
| 0.7548611111111111 | 0 |
| 0.7555555555555555 | 0 |
| 0.75625 | 0 |
| 0.7569444444444445 | 0 |
| 0.7576388888888889 | 0 |
| 0.7583333333333333 | 0 |
| 0.7590277777777777 | 0 |
| 0.7597222222222223 | 0 |
| 0.7604166666666666 | 0 |
| 0.7611111111111111 | 0 |
| 0.7618055555555556 | 0 |
| 0.7625000000000001 | 0 |
| 0.7631944444444444 | 0 |
| 0.7638888888888888 | 0 |
| 0.7645833333333334 | 0 |
| 0.7652777777777778 | 0 |
| 0.7659722222222222 | 0 |
| 0.7666666666666666 | 0 |
| 0.7673611111111112 | 0 |
| 0.7680555555555556 | 0 |
| 0.7687499999999999 | 0 |
| 0.7694444444444444 | 0 |
| 0.7701388888888889 | 0 |
| 0.7708333333333334 | 0 |
| 0.7715277777777777 | 0 |
| 0.7722222222222223 | 0 |
| 0.7729166666666667 | 0 |
| 0.7736111111111111 | 0 |
| 0.7743055555555555 | 0 |
| 0.775 | 0 |
| 0.7756944444444445 | 0 |
| 0.7763888888888889 | 0 |
| 0.7770833333333332 | 0 |
| 0.7777777777777778 | 0 |
| 0.7784722222222222 | 0 |
| 0.7791666666666667 | 0 |
| 0.779861111111111 | 0 |
| 0.7805555555555556 | 0 |
| 0.78125 | 0 |
| 0.7819444444444444 | 0 |
| 0.782638888888889 | 0 |
| 0.7833333333333333 | 0 |
| 0.7840277777777778 | 0 |
| 0.7847222222222222 | 0 |
| 0.7854166666666668 | 0 |
| 0.7861111111111111 | 0 |
| 0.7868055555555555 | 0 |
| 0.7875 | 0 |
| 0.7881944444444445 | 0 |
| 0.7888888888888889 | 0 |
| 0.7895833333333333 | 0 |
| 0.7902777777777777 | 0 |
| 0.7909722222222223 | 0 |
| 0.7916666666666666 | 0 |
| 0.7923611111111111 | 0 |
| 0.7930555555555556 | 0 |
| 0.7937500000000001 | 0 |
| 0.7944444444444444 | 0 |
| 0.7951388888888888 | 0 |
| 0.7958333333333334 | 0 |
| 0.7965277777777778 | 0 |
| 0.7972222222222222 | 0 |
| 0.7979166666666666 | 0 |
| 0.7986111111111112 | 0 |
| 0.7993055555555556 | 0 |
| 0.7999999999999999 | 0 |
| 0.8006944444444444 | 0 |
| 0.8013888888888889 | 0 |
| 0.8020833333333334 | 0 |
| 0.8027777777777777 | 0 |
| 0.8034722222222223 | 0 |
| 0.8041666666666667 | 0 |
| 0.8048611111111111 | 0 |
| 0.8055555555555555 | 0 |
| 0.80625 | 0 |
| 0.8069444444444445 | 0 |
| 0.8076388888888889 | 0 |
| 0.8083333333333332 | 0 |
| 0.8090277777777778 | 0 |
| 0.8097222222222222 | 0 |
| 0.8104166666666667 | 0 |
| 0.811111111111111 | 0 |
| 0.8118055555555556 | 0 |
| 0.8125 | 0 |
| 0.8131944444444444 | 0 |
| 0.813888888888889 | 0 |
| 0.8145833333333333 | 0 |
| 0.8152777777777778 | 0 |
| 0.8159722222222222 | 0 |
| 0.8166666666666668 | 0 |
| 0.8173611111111111 | 0 |
| 0.8180555555555555 | 0 |
| 0.81875 | 0 |
| 0.8194444444444445 | 0 |
| 0.8201388888888889 | 0 |
| 0.8208333333333333 | 0 |
| 0.8215277777777777 | 0 |
| 0.8222222222222223 | 0 |
| 0.8229166666666666 | 0 |
| 0.8236111111111111 | 0 |
| 0.8243055555555556 | 0 |
| 0.8250000000000001 | 0 |
| 0.8256944444444444 | 0 |
| 0.8263888888888888 | 0 |
| 0.8270833333333334 | 0 |
| 0.8277777777777778 | 0 |
| 0.8284722222222222 | 0 |
| 0.8291666666666666 | 0 |
| 0.8298611111111112 | 0 |
| 0.8305555555555556 | 0 |
| 0.8312499999999999 | 0 |
| 0.8319444444444444 | 0 |
| 0.8326388888888889 | 0 |
| 0.8333333333333334 | 0 |
| 0.8340277777777777 | 0 |
| 0.8347222222222223 | 0 |
| 0.8354166666666667 | 0 |
| 0.8361111111111111 | 0 |
| 0.8368055555555555 | 0 |
| 0.8375 | 0 |
| 0.8381944444444445 | 0 |
| 0.8388888888888889 | 0 |
| 0.8395833333333332 | 0 |
| 0.8402777777777778 | 0 |
| 0.8409722222222222 | 0 |
| 0.8416666666666667 | 0 |
| 0.842361111111111 | 0 |
| 0.8430555555555556 | 0 |
| 0.84375 | 0 |
| 0.8444444444444444 | 0 |
| 0.845138888888889 | 0 |
| 0.8458333333333333 | 0 |
| 0.8465277777777778 | 0 |
| 0.8472222222222222 | 0 |
| 0.8479166666666668 | 0 |
| 0.8486111111111111 | 0 |
| 0.8493055555555555 | 0 |
| 0.85 | 0 |
| 0.8506944444444445 | 0 |
| 0.8513888888888889 | 0 |
| 0.8520833333333333 | 0 |
| 0.8527777777777777 | 0 |
| 0.8534722222222223 | 0 |
| 0.8541666666666666 | 0 |
| 0.8548611111111111 | 0 |
| 0.8555555555555556 | 0 |
| 0.8562500000000001 | 0 |
| 0.8569444444444444 | 0 |
| 0.8576388888888888 | 0 |
| 0.8583333333333334 | 0 |
| 0.8590277777777778 | 0 |
| 0.8597222222222222 | 0 |
| 0.8604166666666666 | 0 |
| 0.8611111111111112 | 0 |
| 0.8618055555555556 | 0 |
| 0.8624999999999999 | 0 |
| 0.8631944444444444 | 0 |
| 0.8638888888888889 | 0 |
| 0.8645833333333334 | 0 |
| 0.8652777777777777 | 0 |
| 0.8659722222222223 | 0 |
| 0.8666666666666667 | 0 |
| 0.8673611111111111 | 0 |
| 0.8680555555555555 | 0 |
| 0.86875 | 0 |
| 0.8694444444444445 | 0 |
| 0.8701388888888889 | 0 |
| 0.8708333333333332 | 0 |
| 0.8715277777777778 | 0 |
| 0.8722222222222222 | 0 |
| 0.8729166666666667 | 0 |
| 0.873611111111111 | 0 |
| 0.8743055555555556 | 0 |
| 0.875 | 0 |
| 0.8756944444444444 | 0 |
| 0.876388888888889 | 0 |
| 0.8770833333333333 | 0 |
| 0.8777777777777778 | 0 |
| 0.8784722222222222 | 0 |
| 0.8791666666666668 | 0 |
| 0.8798611111111111 | 0 |
| 0.8805555555555555 | 0 |
| 0.88125 | 0 |
| 0.8819444444444445 | 0 |
| 0.8826388888888889 | 0 |
| 0.8833333333333333 | 0 |
| 0.8840277777777777 | 0 |
| 0.8847222222222223 | 0 |
| 0.8854166666666666 | 0 |
| 0.8861111111111111 | 0 |
| 0.8868055555555556 | 0 |
| 0.8875000000000001 | 0 |
| 0.8881944444444444 | 0 |
| 0.8888888888888888 | 0 |
| 0.8895833333333334 | 0 |
| 0.8902777777777778 | 0 |
| 0.8909722222222222 | 0 |
| 0.8916666666666666 | 0 |
| 0.8923611111111112 | 0 |
| 0.8930555555555556 | 0 |
| 0.8937499999999999 | 0 |
| 0.8944444444444444 | 0 |
| 0.8951388888888889 | 0 |
| 0.8958333333333334 | 0 |
| 0.8965277777777777 | 0 |
| 0.8972222222222223 | 0 |
| 0.8979166666666667 | 0 |
| 0.8986111111111111 | 0 |
| 0.8993055555555555 | 0 |
| 0.9 | 0 |
| 0.9006944444444445 | 0 |
| 0.9013888888888889 | 0 |
| 0.9020833333333332 | 0 |
| 0.9027777777777778 | 0 |
| 0.9034722222222222 | 0 |
| 0.9041666666666667 | 0 |
| 0.904861111111111 | 0 |
| 0.9055555555555556 | 0 |
| 0.90625 | 0 |
| 0.9069444444444444 | 0 |
| 0.907638888888889 | 0 |
| 0.9083333333333333 | 0 |
| 0.9090277777777778 | 0 |
| 0.9097222222222222 | 0 |
| 0.9104166666666668 | 0 |
| 0.9111111111111111 | 0 |
| 0.9118055555555555 | 0 |
| 0.9125 | 0 |
| 0.9131944444444445 | 0 |
| 0.9138888888888889 | 0 |
| 0.9145833333333333 | 0 |
| 0.9152777777777777 | 0 |
| 0.9159722222222223 | 0 |
| 0.9166666666666666 | 0 |
| 0.9173611111111111 | 0 |
| 0.9180555555555556 | 0 |
| 0.9187500000000001 | 0 |
| 0.9194444444444444 | 0 |
| 0.9201388888888888 | 0 |
| 0.9208333333333334 | 0 |
| 0.9215277777777778 | 0 |
| 0.9222222222222222 | 0 |
| 0.9229166666666666 | 0 |
| 0.9236111111111112 | 0 |
| 0.9243055555555556 | 0 |
| 0.9249999999999999 | 0 |
| 0.9256944444444444 | 0 |
| 0.9263888888888889 | 0 |
| 0.9270833333333334 | 0 |
| 0.9277777777777777 | 0 |
| 0.9284722222222223 | 0 |
| 0.9291666666666667 | 0 |
| 0.9298611111111111 | 0 |
| 0.9305555555555555 | 0 |
| 0.93125 | 0 |
| 0.9319444444444445 | 0 |
| 0.9326388888888889 | 0 |
| 0.9333333333333332 | 0 |
| 0.9340277777777778 | 0 |
| 0.9347222222222222 | 0 |
| 0.9354166666666667 | 0 |
| 0.936111111111111 | 0 |
| 0.9368055555555556 | 0 |
| 0.9375 | 0 |
| 0.9381944444444444 | 0 |
| 0.938888888888889 | 0 |
| 0.9395833333333333 | 0 |
| 0.9402777777777778 | 0 |
| 0.9409722222222222 | 0 |
| 0.9416666666666668 | 0 |
| 0.9423611111111111 | 0 |
| 0.9430555555555555 | 0 |
| 0.94375 | 0 |
| 0.9444444444444445 | 0 |
| 0.9451388888888889 | 0 |
| 0.9458333333333333 | 0 |
| 0.9465277777777777 | 0 |
| 0.9472222222222223 | 0 |
| 0.9479166666666666 | 0 |
| 0.9486111111111111 | 0 |
| 0.9493055555555556 | 0 |
| 0.9500000000000001 | 0 |
| 0.9506944444444444 | 0 |
| 0.9513888888888888 | 0 |
| 0.9520833333333334 | 0 |
| 0.9527777777777778 | 0 |
| 0.9534722222222222 | 0 |
| 0.9541666666666666 | 0 |
| 0.9548611111111112 | 0 |
| 0.9555555555555556 | 0 |
| 0.9562499999999999 | 0 |
| 0.9569444444444444 | 0 |
| 0.9576388888888889 | 0 |
| 0.9583333333333334 | 0 |
| 0.9590277777777777 | 0 |
| 0.9597222222222223 | 0 |
| 0.9604166666666667 | 0 |
| 0.9611111111111111 | 0 |
| 0.9618055555555555 | 0 |
| 0.9625 | 0 |
| 0.9631944444444445 | 0 |
| 0.9638888888888889 | 0 |
| 0.9645833333333332 | 0 |
| 0.9652777777777778 | 0 |
| 0.9659722222222222 | 0 |
| 0.9666666666666667 | 0 |
| 0.967361111111111 | 0 |
| 0.9680555555555556 | 0 |
| 0.96875 | 0 |
| 0.9694444444444444 | 0 |
| 0.970138888888889 | 0 |
| 0.9708333333333333 | 0 |
| 0.9715277777777778 | 0 |
| 0.9722222222222222 | 0 |
| 0.9729166666666668 | 0 |
| 0.9736111111111111 | 0 |
| 0.9743055555555555 | 0 |
| 0.975 | 0 |
| 0.9756944444444445 | 0 |
| 0.9763888888888889 | 0 |
| 0.9770833333333333 | 0 |
| 0.9777777777777777 | 0 |
| 0.9784722222222223 | 0 |
| 0.9791666666666666 | 0 |
| 0.9798611111111111 | 0 |
| 0.9805555555555556 | 0 |
| 0.9812500000000001 | 0 |
| 0.9819444444444444 | 0 |
| 0.9826388888888888 | 0 |
| 0.9833333333333334 | 0 |
| 0.9840277777777778 | 0 |
| 0.9847222222222222 | 0 |
| 0.9854166666666666 | 0 |
| 0.9861111111111112 | 0 |
| 0.9868055555555556 | 0 |
| 0.9874999999999999 | 0 |
| 0.9881944444444444 | 0 |
| 0.9888888888888889 | 0 |
| 0.9895833333333334 | 0 |
| 0.9902777777777777 | 0 |
| 0.9909722222222223 | 0 |
| 0.9916666666666667 | 0 |
| 0.9923611111111111 | 0 |
| 0.9930555555555555 | 0 |
| 0.99375 | 0 |
| 0.9944444444444445 | 0 |
| 0.9951388888888889 | 0 |
| 0.9958333333333332 | 0 |
| 0.9965277777777778 | 0 |
| 0.9972222222222222 | 0 |
| 0.9979166666666667 | 0 |
| 0.998611111111111 | 0 |
| 0.9993055555555556 | 0 |